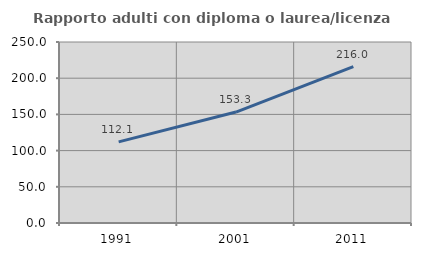
| Category | Rapporto adulti con diploma o laurea/licenza media  |
|---|---|
| 1991.0 | 112.08 |
| 2001.0 | 153.267 |
| 2011.0 | 215.959 |